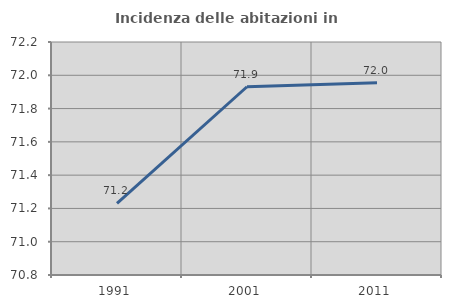
| Category | Incidenza delle abitazioni in proprietà  |
|---|---|
| 1991.0 | 71.23 |
| 2001.0 | 71.931 |
| 2011.0 | 71.954 |